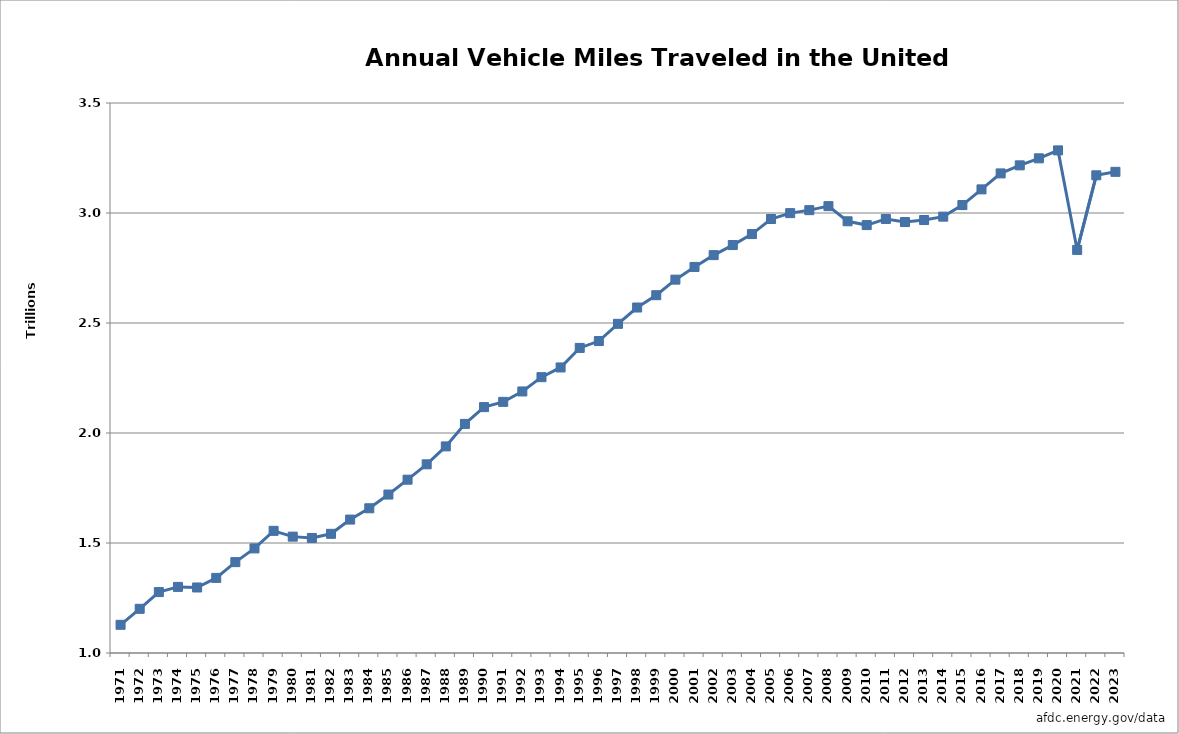
| Category | Series 0 | Series 1 |
|---|---|---|
| 1971.0 | 1971 | 1128168 |
| 1972.0 | 1972 | 1200898 |
| 1973.0 | 1973 | 1276857 |
| 1974.0 | 1974 | 1300512 |
| 1975.0 | 1975 | 1297834 |
| 1976.0 | 1976 | 1341416 |
| 1977.0 | 1977 | 1413035 |
| 1978.0 | 1978 | 1475402 |
| 1979.0 | 1979 | 1555360 |
| 1980.0 | 1980 | 1528928 |
| 1981.0 | 1981 | 1522870 |
| 1982.0 | 1982 | 1541724 |
| 1983.0 | 1983 | 1606475 |
| 1984.0 | 1984 | 1657857 |
| 1985.0 | 1985 | 1720246 |
| 1986.0 | 1986 | 1787798 |
| 1987.0 | 1987 | 1857631 |
| 1988.0 | 1988 | 1939041 |
| 1989.0 | 1989 | 2041441 |
| 1990.0 | 1990 | 2117716 |
| 1991.0 | 1991 | 2141582 |
| 1992.0 | 1992 | 2188830 |
| 1993.0 | 1993 | 2253820 |
| 1994.0 | 1994 | 2297939 |
| 1995.0 | 1995 | 2386720 |
| 1996.0 | 1996 | 2417911 |
| 1997.0 | 1997 | 2496251 |
| 1998.0 | 1998 | 2570334 |
| 1999.0 | 1999 | 2626392 |
| 2000.0 | 2000 | 2697095 |
| 2001.0 | 2001 | 2754784 |
| 2002.0 | 2002 | 2808501 |
| 2003.0 | 2003 | 2854268 |
| 2004.0 | 2004 | 2904170 |
| 2005.0 | 2005 | 2972672 |
| 2006.0 | 2006 | 2999380 |
| 2007.0 | 2007 | 3012977 |
| 2008.0 | 2008 | 3031224 |
| 2009.0 | 2009 | 2962426 |
| 2010.0 | 2010 | 2945064 |
| 2011.0 | 2011 | 2973046 |
| 2012.0 | 2012 | 2958872 |
| 2013.0 | 2013 | 2968068 |
| 2014.0 | 2014 | 2983420 |
| 2015.0 | 2015 | 3036013 |
| 2016.0 | 2016 | 3107344 |
| 2017.0 | 2017 | 3179963 |
| 2018.0 | 2018 | 3216598 |
| 2019.0 | 2019 | 3248548 |
| 2020.0 | 2020 | 3284596 |
| 2021.0 | 2021 | 2832199 |
| 2022.0 | 2022 | 3171317 |
| 2023.0 | 2023 | 3187189 |